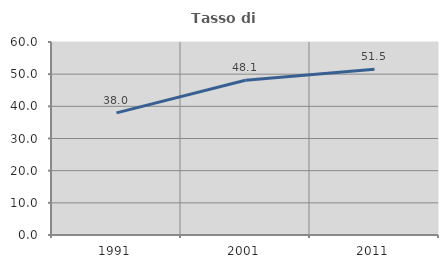
| Category | Tasso di occupazione   |
|---|---|
| 1991.0 | 37.961 |
| 2001.0 | 48.131 |
| 2011.0 | 51.549 |